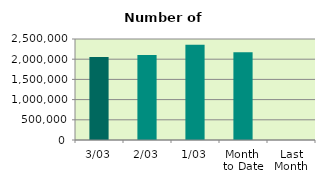
| Category | Series 0 |
|---|---|
| 3/03 | 2053816 |
| 2/03 | 2104354 |
| 1/03 | 2357494 |
| Month 
to Date | 2171888 |
| Last
Month | 0 |